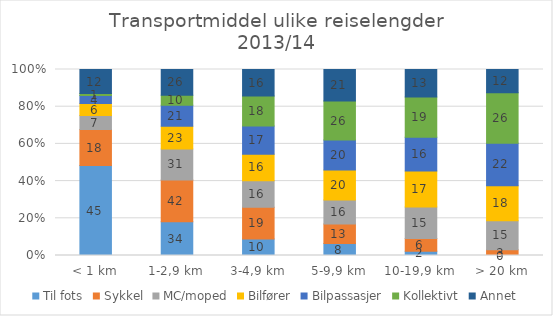
| Category | Til fots | Sykkel | MC/moped | Bilfører | Bilpassasjer | Kollektivt | Annet |
|---|---|---|---|---|---|---|---|
| < 1 km | 45 | 18 | 7 | 6 | 4 | 1 | 12 |
| 1-2,9 km | 34 | 42 | 31 | 23 | 21 | 10 | 26 |
| 3-4,9 km | 10 | 19 | 16 | 16 | 17 | 18 | 16 |
| 5-9,9 km | 8 | 13 | 16 | 20 | 20 | 26 | 21 |
| 10-19,9 km | 2 | 6 | 15 | 17 | 16 | 19 | 13 |
| > 20 km | 0 | 3 | 15 | 18 | 22 | 26 | 12 |